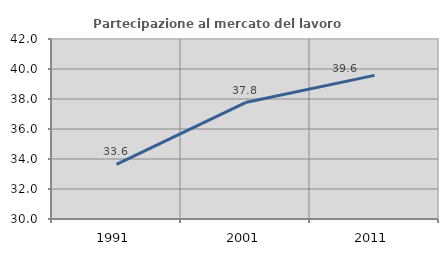
| Category | Partecipazione al mercato del lavoro  femminile |
|---|---|
| 1991.0 | 33.639 |
| 2001.0 | 37.764 |
| 2011.0 | 39.577 |